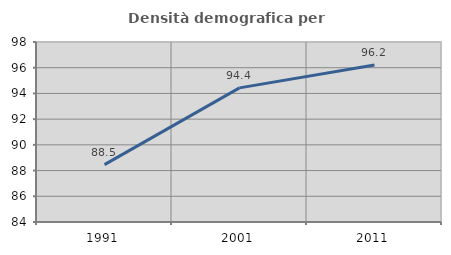
| Category | Densità demografica |
|---|---|
| 1991.0 | 88.465 |
| 2001.0 | 94.43 |
| 2011.0 | 96.21 |